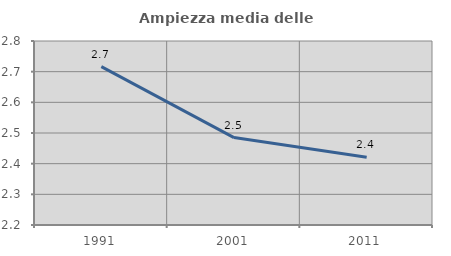
| Category | Ampiezza media delle famiglie |
|---|---|
| 1991.0 | 2.717 |
| 2001.0 | 2.485 |
| 2011.0 | 2.421 |